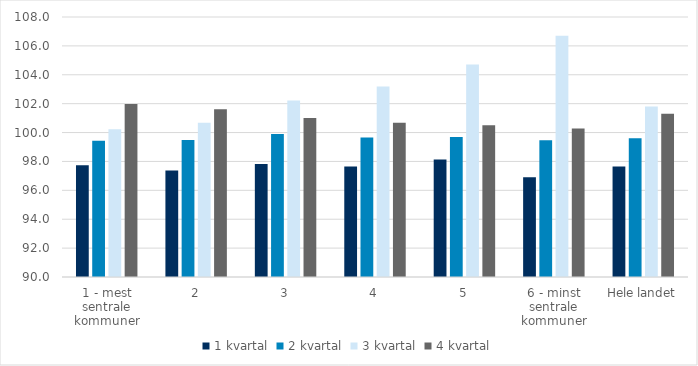
| Category | 1 kvartal | 2 kvartal | 3 kvartal | 4 kvartal |
|---|---|---|---|---|
| 1 - mest sentrale kommuner | 97.734 | 99.441 | 100.23 | 101.984 |
| 2 | 97.37 | 99.482 | 100.676 | 101.614 |
| 3 | 97.826 | 99.895 | 102.219 | 101.007 |
| 4 | 97.647 | 99.66 | 103.193 | 100.684 |
| 5 | 98.136 | 99.695 | 104.713 | 100.507 |
| 6 - minst sentrale kommuner | 96.9 | 99.466 | 106.7 | 100.28 |
| Hele landet | 97.647 | 99.606 | 101.809 | 101.302 |